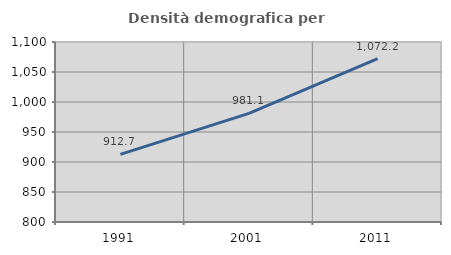
| Category | Densità demografica |
|---|---|
| 1991.0 | 912.714 |
| 2001.0 | 981.064 |
| 2011.0 | 1072.152 |